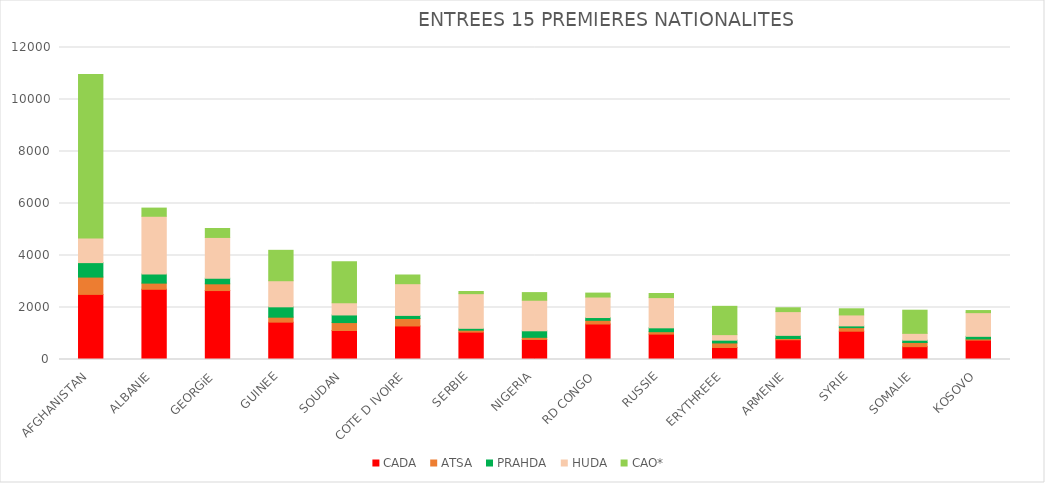
| Category | CADA  | ATSA  | PRAHDA  | HUDA  | CAO*  |
|---|---|---|---|---|---|
| AFGHANISTAN | 2504 | 666 | 556 | 947 | 6293 |
| ALBANIE | 2701 | 237 | 351 | 2220 | 314 |
| GEORGiE | 2651 | 260 | 215 | 1569 | 344 |
| GUINEE | 1437 | 191 | 398 | 1004 | 1169 |
| SOUDAN | 1115 | 305 | 293 | 467 | 1580 |
| COTE D IVOIRE | 1290 | 286 | 120 | 1220 | 334 |
| SERBIE | 1053 | 75 | 71 | 1334 | 83 |
| NIGERIA | 771 | 82 | 251 | 1175 | 294 |
| RD CONGO | 1365 | 142 | 107 | 789 | 151 |
| RUSSIE | 976 | 94 | 148 | 1163 | 158 |
| ERYTHREEE | 462 | 175 | 106 | 214 | 1088 |
| ARMENIE | 760 | 47 | 121 | 914 | 147 |
| SYRIE | 1088 | 137 | 68 | 421 | 236 |
| SOMALIE | 493 | 162 | 87 | 264 | 890 |
| KOSOVO | 745 | 45 | 101 | 911 | 81 |